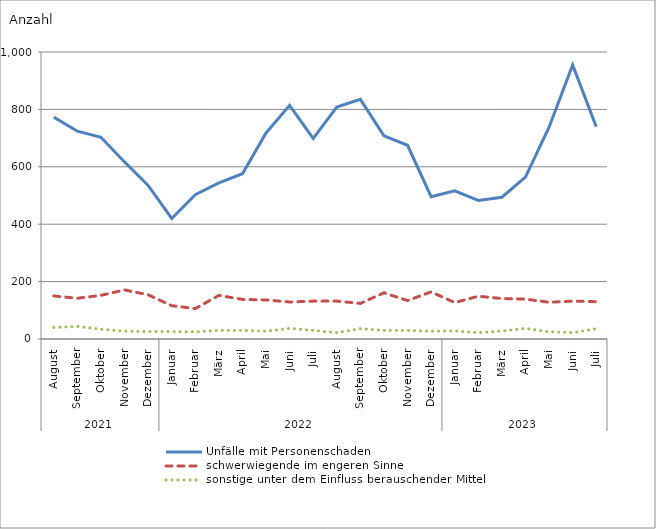
| Category | Unfälle mit Personenschaden | schwerwiegende im engeren Sinne | sonstige unter dem Einfluss berauschender Mittel |
|---|---|---|---|
| 0 | 773 | 150 | 40 |
| 1 | 724 | 142 | 44 |
| 2 | 703 | 152 | 34 |
| 3 | 617 | 171 | 27 |
| 4 | 535 | 154 | 26 |
| 5 | 420 | 116 | 26 |
| 6 | 503 | 106 | 25 |
| 7 | 544 | 152 | 30 |
| 8 | 576 | 138 | 30 |
| 9 | 718 | 136 | 27 |
| 10 | 814 | 129 | 37 |
| 11 | 699 | 132 | 30 |
| 12 | 808 | 132 | 22 |
| 13 | 835 | 124 | 36 |
| 14 | 708 | 161 | 30 |
| 15 | 675 | 134 | 30 |
| 16 | 496 | 164 | 27 |
| 17 | 516 | 127 | 28 |
| 18 | 483 | 149 | 22 |
| 19 | 494 | 141 | 28 |
| 20 | 564 | 139 | 37 |
| 21 | 738 | 128 | 25 |
| 22 | 955 | 132 | 22 |
| 23 | 740 | 130 | 36 |